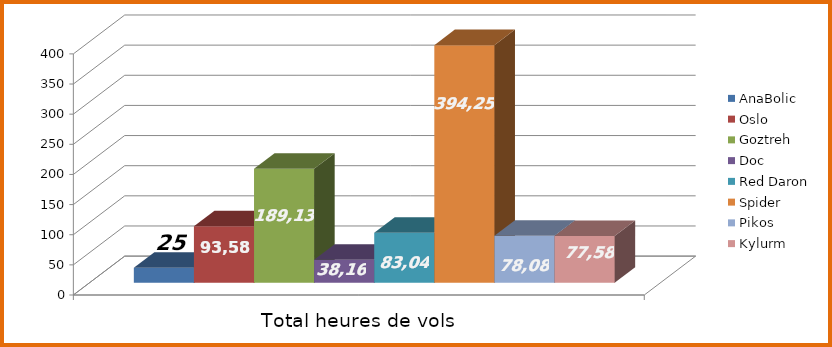
| Category | AnaBolic | Oslo | Goztreh | Doc | Red Daron | Spider | Pikos | Kylurm |
|---|---|---|---|---|---|---|---|---|
| 0 | 25 | 93.58 | 189.13 | 38.16 | 83.04 | 394.25 | 78.08 | 77.58 |